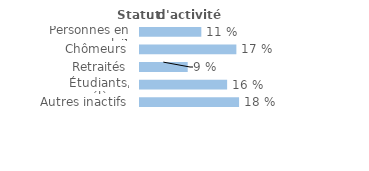
| Category | Series 0 |
|---|---|
| Personnes en emploi¹ | 0.11 |
| Chômeurs | 0.172 |
| Retraités | 0.085 |
| Étudiants, élèves | 0.156 |
| Autres inactifs  | 0.177 |